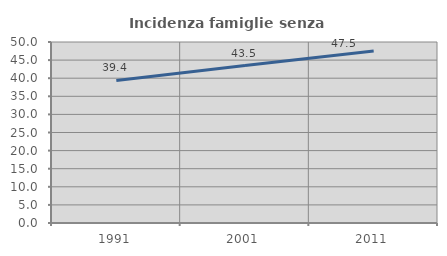
| Category | Incidenza famiglie senza nuclei |
|---|---|
| 1991.0 | 39.368 |
| 2001.0 | 43.492 |
| 2011.0 | 47.529 |